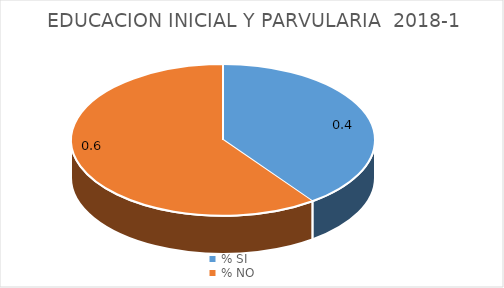
| Category | Series 0 |
|---|---|
| % SI | 0.4 |
| % NO | 0.6 |